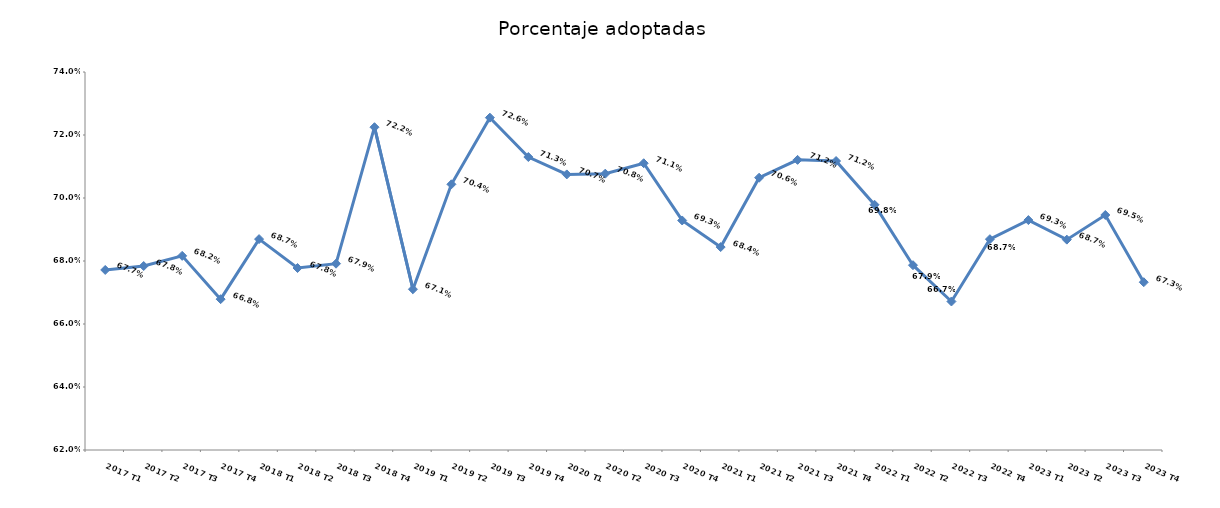
| Category | Porcentaje adoptadas |
|---|---|
| 2017 T1 | 0.677 |
| 2017 T2 | 0.678 |
| 2017 T3 | 0.682 |
| 2017 T4 | 0.668 |
| 2018 T1 | 0.687 |
| 2018 T2 | 0.678 |
| 2018 T3 | 0.679 |
| 2018 T4 | 0.722 |
| 2019 T1 | 0.671 |
| 2019 T2 | 0.704 |
| 2019 T3 | 0.726 |
| 2019 T4 | 0.713 |
| 2020 T1 | 0.707 |
| 2020 T2 | 0.708 |
| 2020 T3 | 0.711 |
| 2020 T4 | 0.693 |
| 2021 T1 | 0.684 |
| 2021 T2 | 0.706 |
| 2021 T3 | 0.712 |
| 2021 T4 | 0.712 |
| 2022 T1 | 0.698 |
| 2022 T2 | 0.679 |
| 2022 T3 | 0.667 |
| 2022 T4 | 0.687 |
| 2023 T1 | 0.693 |
| 2023 T2 | 0.687 |
| 2023 T3 | 0.695 |
| 2023 T4 | 0.673 |